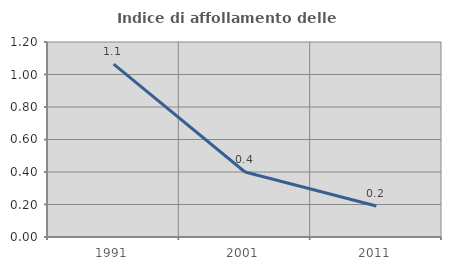
| Category | Indice di affollamento delle abitazioni  |
|---|---|
| 1991.0 | 1.064 |
| 2001.0 | 0.4 |
| 2011.0 | 0.19 |